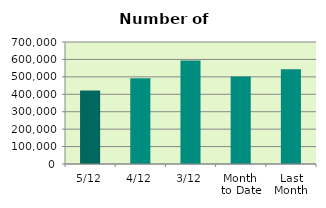
| Category | Series 0 |
|---|---|
| 5/12 | 421810 |
| 4/12 | 491638 |
| 3/12 | 593480 |
| Month 
to Date | 502309.333 |
| Last
Month | 544187.818 |